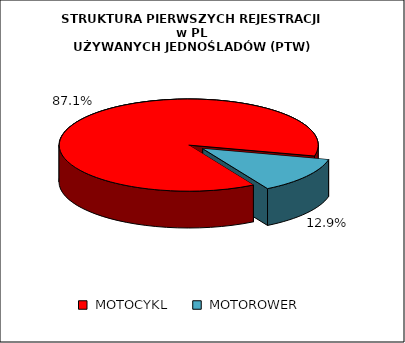
| Category | RAZEM |
|---|---|
|  MOTOCYKL  | 0.871 |
|  MOTOROWER  | 0.129 |